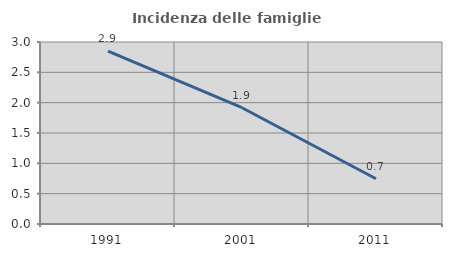
| Category | Incidenza delle famiglie numerose |
|---|---|
| 1991.0 | 2.85 |
| 2001.0 | 1.917 |
| 2011.0 | 0.746 |